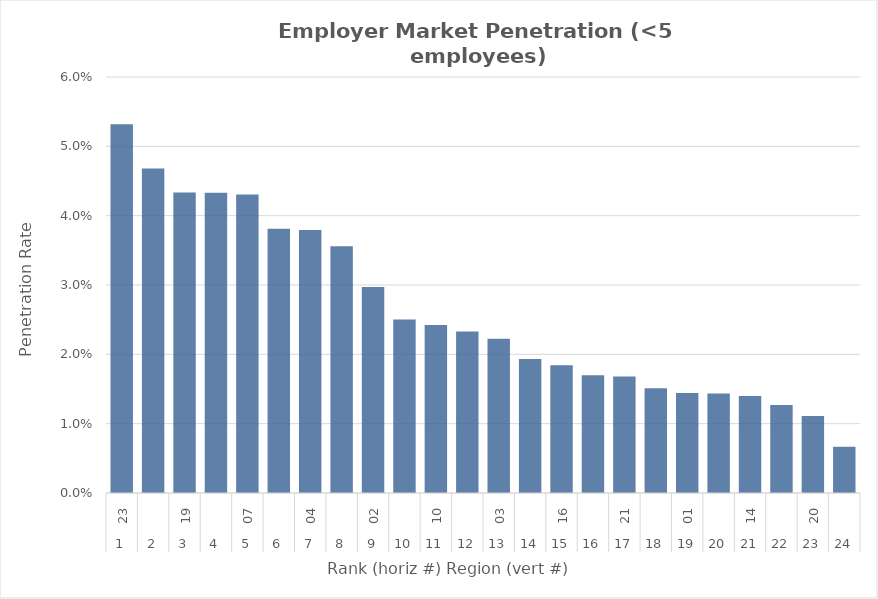
| Category | Rate |
|---|---|
| 0 | 0.053 |
| 1 | 0.047 |
| 2 | 0.043 |
| 3 | 0.043 |
| 4 | 0.043 |
| 5 | 0.038 |
| 6 | 0.038 |
| 7 | 0.036 |
| 8 | 0.03 |
| 9 | 0.025 |
| 10 | 0.024 |
| 11 | 0.023 |
| 12 | 0.022 |
| 13 | 0.019 |
| 14 | 0.018 |
| 15 | 0.017 |
| 16 | 0.017 |
| 17 | 0.015 |
| 18 | 0.014 |
| 19 | 0.014 |
| 20 | 0.014 |
| 21 | 0.013 |
| 22 | 0.011 |
| 23 | 0.007 |